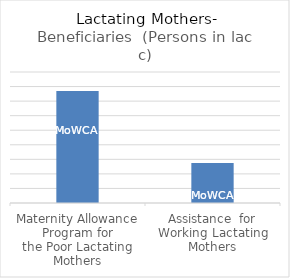
| Category | Beneficiaries  (Persons in lac) |
|---|---|
| Maternity Allowance Program for
the Poor Lactating Mothers | 7.7 |
| Assistance  for Working Lactating
Mothers | 2.75 |